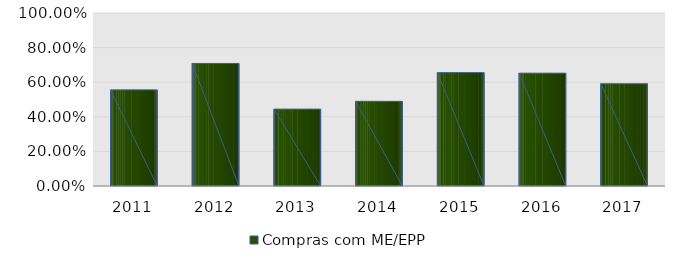
| Category | Compras com ME/EPP |
|---|---|
| 2011.0 | 0.556 |
| 2012.0 | 0.708 |
| 2013.0 | 0.444 |
| 2014.0 | 0.489 |
| 2015.0 | 0.655 |
| 2016.0 | 0.652 |
| 2017.0 | 0.591 |